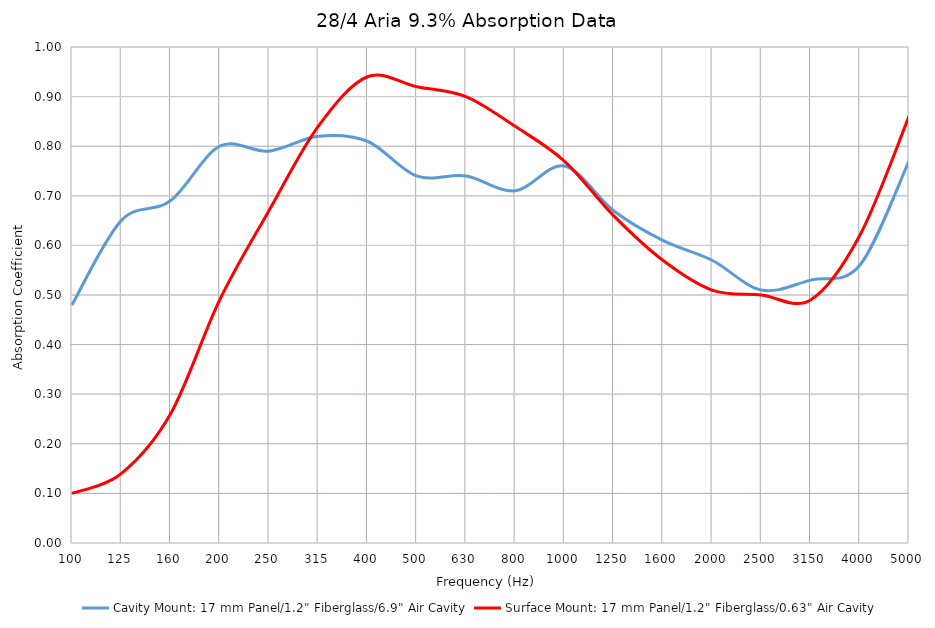
| Category | Cavity Mount: 17 mm Panel/1.2" Fiberglass/6.9" Air Cavity | Surface Mount: 17 mm Panel/1.2" Fiberglass/0.63" Air Cavity |
|---|---|---|
| 100.0 | 0.48 | 0.1 |
| 125.0 | 0.65 | 0.14 |
| 160.0 | 0.69 | 0.26 |
| 200.0 | 0.8 | 0.49 |
| 250.0 | 0.79 | 0.67 |
| 315.0 | 0.82 | 0.84 |
| 400.0 | 0.81 | 0.94 |
| 500.0 | 0.74 | 0.92 |
| 630.0 | 0.74 | 0.9 |
| 800.0 | 0.71 | 0.84 |
| 1000.0 | 0.76 | 0.77 |
| 1250.0 | 0.67 | 0.66 |
| 1600.0 | 0.61 | 0.57 |
| 2000.0 | 0.57 | 0.51 |
| 2500.0 | 0.51 | 0.5 |
| 3150.0 | 0.53 | 0.49 |
| 4000.0 | 0.56 | 0.62 |
| 5000.0 | 0.77 | 0.86 |